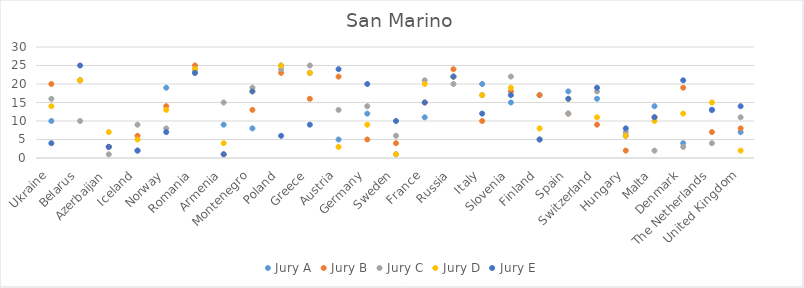
| Category | Jury A | Jury B | Jury C | Jury D | Jury E |
|---|---|---|---|---|---|
| Ukraine | 10 | 20 | 16 | 14 | 4 |
| Belarus | 21 | 21 | 10 | 21 | 25 |
| Azerbaijan | 3 | 3 | 1 | 7 | 3 |
| Iceland | 2 | 6 | 9 | 5 | 2 |
| Norway | 19 | 14 | 8 | 13 | 7 |
| Romania | 24 | 25 | 23 | 24 | 23 |
| Armenia | 9 | 1 | 15 | 4 | 1 |
| Montenegro | 8 | 13 | 19 | 18 | 18 |
| Poland | 25 | 23 | 24 | 25 | 6 |
| Greece | 23 | 16 | 25 | 23 | 9 |
| Austria | 5 | 22 | 13 | 3 | 24 |
| Germany | 12 | 5 | 14 | 9 | 20 |
| Sweden | 1 | 4 | 6 | 1 | 10 |
| France | 11 | 15 | 21 | 20 | 15 |
| Russia | 22 | 24 | 20 | 22 | 22 |
| Italy | 20 | 10 | 17 | 17 | 12 |
| Slovenia | 15 | 18 | 22 | 19 | 17 |
| Finland | 17 | 17 | 5 | 8 | 5 |
| Spain | 18 | 12 | 12 | 16 | 16 |
| Switzerland | 16 | 9 | 18 | 11 | 19 |
| Hungary | 6 | 2 | 7 | 6 | 8 |
| Malta | 14 | 11 | 2 | 10 | 11 |
| Denmark | 4 | 19 | 3 | 12 | 21 |
| The Netherlands | 13 | 7 | 4 | 15 | 13 |
| United Kingdom | 7 | 8 | 11 | 2 | 14 |